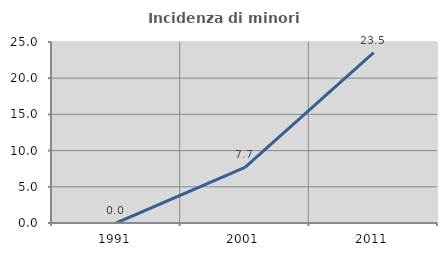
| Category | Incidenza di minori stranieri |
|---|---|
| 1991.0 | 0 |
| 2001.0 | 7.692 |
| 2011.0 | 23.529 |